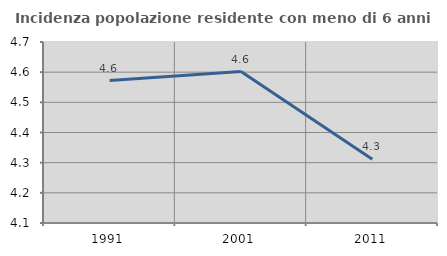
| Category | Incidenza popolazione residente con meno di 6 anni |
|---|---|
| 1991.0 | 4.572 |
| 2001.0 | 4.602 |
| 2011.0 | 4.312 |